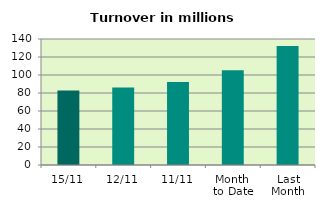
| Category | Series 0 |
|---|---|
| 15/11 | 82.863 |
| 12/11 | 86.022 |
| 11/11 | 92.138 |
| Month 
to Date | 105.411 |
| Last
Month | 132.268 |